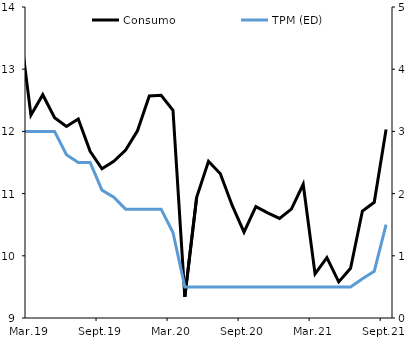
| Category | Consumo |
|---|---|
| 2013-01-01 | 17.879 |
| 2013-02-01 | 18.012 |
| 2013-03-01 | 15.957 |
| 2013-04-01 | 16.218 |
| 2013-05-01 | 16.35 |
| 2013-06-01 | 15.957 |
| 2013-07-01 | 16.277 |
| 2013-08-01 | 15.592 |
| 2013-09-01 | 14.208 |
| 2013-10-01 | 15.767 |
| 2013-11-01 | 15.58 |
| 2013-12-01 | 15.988 |
| 2014-01-01 | 16.78 |
| 2014-02-01 | 16.79 |
| 2014-03-01 | 15.11 |
| 2014-04-01 | 15.25 |
| 2014-05-01 | 15.47 |
| 2014-06-01 | 15.23 |
| 2014-07-01 | 15.2 |
| 2014-08-01 | 14.59 |
| 2014-09-01 | 14.39 |
| 2014-10-01 | 14.48 |
| 2014-11-01 | 14.76 |
| 2014-12-01 | 15.01 |
| 2015-01-01 | 15.33 |
| 2015-02-01 | 15.4 |
| 2015-03-01 | 13.73 |
| 2015-04-01 | 14.2 |
| 2015-05-01 | 14.09 |
| 2015-06-01 | 13.97 |
| 2015-07-01 | 14.25 |
| 2015-08-01 | 13.96 |
| 2015-09-01 | 13.93 |
| 2015-10-01 | 14.3 |
| 2015-11-01 | 14.68 |
| 2015-12-01 | 14.97 |
| 2016-01-01 | 15.45 |
| 2016-02-01 | 15.35 |
| 2016-03-01 | 14.01 |
| 2016-04-01 | 14.24 |
| 2016-05-01 | 14.25 |
| 2016-06-01 | 14.22 |
| 2016-07-01 | 14.58 |
| 2016-08-01 | 14.38 |
| 2016-09-01 | 14.35 |
| 2016-10-01 | 14.61 |
| 2016-11-01 | 14.73 |
| 2016-12-01 | 14.58 |
| 2017-01-01 | 15.27 |
| 2017-02-01 | 15.12 |
| 2017-03-01 | 13.59 |
| 2017-04-01 | 13.99 |
| 2017-05-01 | 13.72 |
| 2017-06-01 | 13.53 |
| 2017-07-01 | 13.83 |
| 2017-08-01 | 13.39 |
| 2017-09-01 | 13.4 |
| 2017-10-01 | 13.57 |
| 2017-11-01 | 13.51 |
| 2017-12-01 | 13.98 |
| 2018-01-01 | 13.99 |
| 2018-02-01 | 13.9 |
| 2018-03-01 | 12.75 |
| 2018-04-01 | 13.08 |
| 2018-05-01 | 12.97 |
| 2018-06-01 | 12.7 |
| 2018-07-01 | 13.19 |
| 2018-08-01 | 12.89 |
| 2018-09-01 | 12.78 |
| 2018-10-01 | 13.07 |
| 2018-11-01 | 13.29 |
| 2018-12-01 | 13.46 |
| 2019-01-01 | 14.04 |
| 2019-02-01 | 13.78 |
| 2019-03-01 | 12.26 |
| 2019-04-01 | 12.59 |
| 2019-05-01 | 12.22 |
| 2019-06-01 | 12.08 |
| 2019-07-01 | 12.2 |
| 2019-08-01 | 11.68 |
| 2019-09-01 | 11.4 |
| 2019-10-01 | 11.52 |
| 2019-11-01 | 11.7 |
| 2019-12-01 | 12.01 |
| 2020-01-01 | 12.57 |
| 2020-02-01 | 12.58 |
| 2020-03-01 | 12.34 |
| 2020-04-01 | 9.34 |
| 2020-05-01 | 10.94 |
| 2020-06-01 | 11.52 |
| 2020-07-01 | 11.32 |
| 2020-08-01 | 10.81 |
| 2020-09-01 | 10.38 |
| 2020-10-01 | 10.79 |
| 2020-11-01 | 10.69 |
| 2020-12-01 | 10.6 |
| 2021-01-01 | 10.75 |
| 2021-02-01 | 11.15 |
| 2021-03-01 | 9.71 |
| 2021-04-01 | 9.97 |
| 2021-05-01 | 9.58 |
| 2021-06-01 | 9.8 |
| 2021-07-01 | 10.72 |
| 2021-08-01 | 10.86 |
| 2021-09-01 | 12.03 |